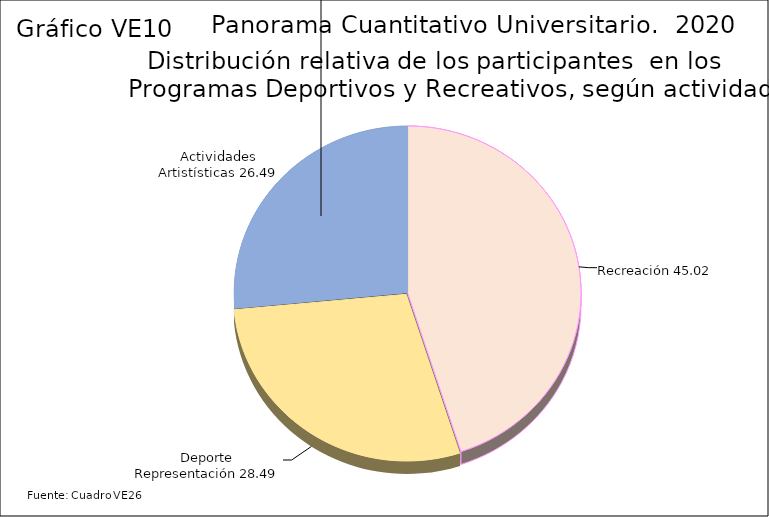
| Category | Series 3 |
|---|---|
| Recreación | 45.02 |
| Deporte Representación | 28.49 |
| Actividades Artistísticas | 26.49 |